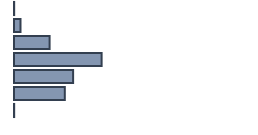
| Category | Percentatge |
|---|---|
| 0 | 0.069 |
| 1 | 2.721 |
| 2 | 14.831 |
| 3 | 36.507 |
| 4 | 24.63 |
| 5 | 21.172 |
| 6 | 0.071 |